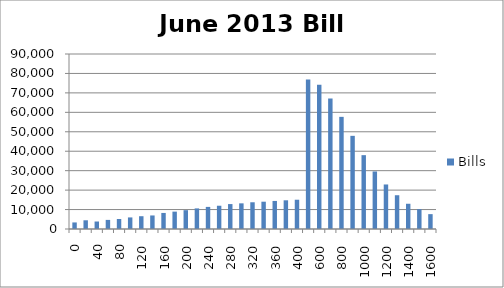
| Category | Bills |
|---|---|
| 0.0 | 3374.624 |
| 20.0 | 4481.029 |
| 40.0 | 3852.386 |
| 60.0 | 4682.414 |
| 80.0 | 5139.941 |
| 100.0 | 5951.335 |
| 120.0 | 6577.222 |
| 140.0 | 6963.318 |
| 160.0 | 8254.734 |
| 180.0 | 8936.392 |
| 200.0 | 9685.402 |
| 220.0 | 10594.635 |
| 240.0 | 11367.346 |
| 260.0 | 11965.492 |
| 280.0 | 12820.524 |
| 300.0 | 13195.638 |
| 320.0 | 13745.446 |
| 340.0 | 14041.157 |
| 360.0 | 14427.373 |
| 380.0 | 14760.518 |
| 400.0 | 15052.643 |
| 500.0 | 76913.694 |
| 600.0 | 74212.727 |
| 700.0 | 67055.839 |
| 800.0 | 57675.189 |
| 900.0 | 47909.469 |
| 1000.0 | 37977.127 |
| 1100.0 | 29586.041 |
| 1200.0 | 22899.509 |
| 1300.0 | 17368.678 |
| 1400.0 | 12983.044 |
| 1500.0 | 10201.636 |
| 1600.0 | 7643.826 |